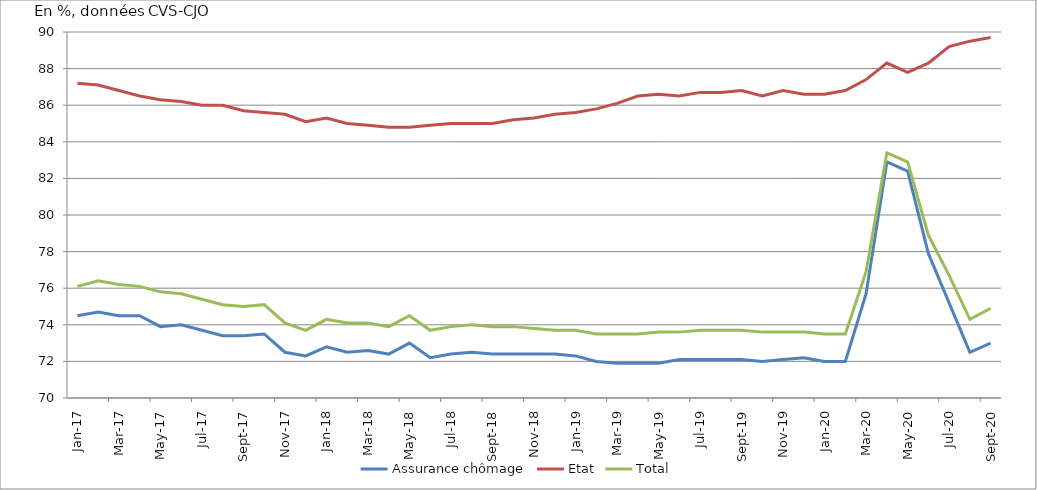
| Category | Assurance chômage | Etat | Total |
|---|---|---|---|
| 2017-01-01 | 74.5 | 87.2 | 76.1 |
| 2017-02-01 | 74.7 | 87.1 | 76.4 |
| 2017-03-01 | 74.5 | 86.8 | 76.2 |
| 2017-04-01 | 74.5 | 86.5 | 76.1 |
| 2017-05-01 | 73.9 | 86.3 | 75.8 |
| 2017-06-01 | 74 | 86.2 | 75.7 |
| 2017-07-01 | 73.7 | 86 | 75.4 |
| 2017-08-01 | 73.4 | 86 | 75.1 |
| 2017-09-01 | 73.4 | 85.7 | 75 |
| 2017-10-01 | 73.5 | 85.6 | 75.1 |
| 2017-11-01 | 72.5 | 85.5 | 74.1 |
| 2017-12-01 | 72.3 | 85.1 | 73.7 |
| 2018-01-01 | 72.8 | 85.3 | 74.3 |
| 2018-02-01 | 72.5 | 85 | 74.1 |
| 2018-03-01 | 72.6 | 84.9 | 74.1 |
| 2018-04-01 | 72.4 | 84.8 | 73.9 |
| 2018-05-01 | 73 | 84.8 | 74.5 |
| 2018-06-01 | 72.2 | 84.9 | 73.7 |
| 2018-07-01 | 72.4 | 85 | 73.9 |
| 2018-08-01 | 72.5 | 85 | 74 |
| 2018-09-01 | 72.4 | 85 | 73.9 |
| 2018-10-01 | 72.4 | 85.2 | 73.9 |
| 2018-11-01 | 72.4 | 85.3 | 73.8 |
| 2018-12-01 | 72.4 | 85.5 | 73.7 |
| 2019-01-01 | 72.3 | 85.6 | 73.7 |
| 2019-02-01 | 72 | 85.8 | 73.5 |
| 2019-03-01 | 71.9 | 86.1 | 73.5 |
| 2019-04-01 | 71.9 | 86.5 | 73.5 |
| 2019-05-01 | 71.9 | 86.6 | 73.6 |
| 2019-06-01 | 72.1 | 86.5 | 73.6 |
| 2019-07-01 | 72.1 | 86.7 | 73.7 |
| 2019-08-01 | 72.1 | 86.7 | 73.7 |
| 2019-09-01 | 72.1 | 86.8 | 73.7 |
| 2019-10-01 | 72 | 86.5 | 73.6 |
| 2019-11-01 | 72.1 | 86.8 | 73.6 |
| 2019-12-01 | 72.2 | 86.6 | 73.6 |
| 2020-01-01 | 72 | 86.6 | 73.5 |
| 2020-02-01 | 72 | 86.8 | 73.5 |
| 2020-03-01 | 75.7 | 87.4 | 76.9 |
| 2020-04-01 | 82.9 | 88.3 | 83.4 |
| 2020-05-01 | 82.4 | 87.8 | 82.9 |
| 2020-06-01 | 77.9 | 88.3 | 78.9 |
| 2020-07-01 | 75.2 | 89.2 | 76.7 |
| 2020-08-01 | 72.5 | 89.5 | 74.3 |
| 2020-09-01 | 73 | 89.7 | 74.9 |